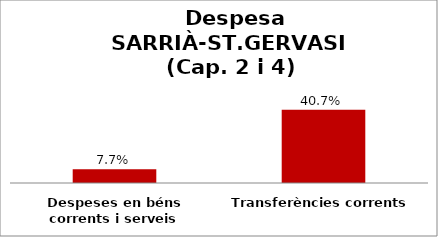
| Category | Series 0 |
|---|---|
| Despeses en béns corrents i serveis | 0.077 |
| Transferències corrents | 0.407 |